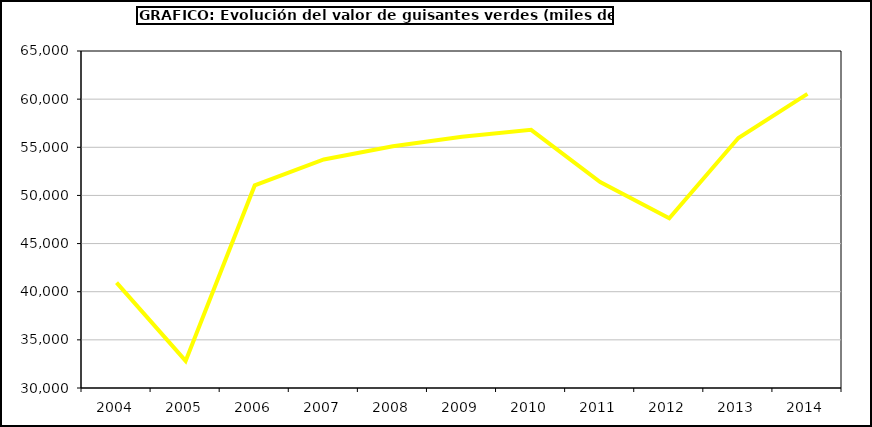
| Category | Valor |
|---|---|
| 2004.0 | 40945.269 |
| 2005.0 | 32811.593 |
| 2006.0 | 51039.987 |
| 2007.0 | 53737.412 |
| 2008.0 | 55115.003 |
| 2009.0 | 56100.148 |
| 2010.0 | 56808.753 |
| 2011.0 | 51384.72 |
| 2012.0 | 47635.04 |
| 2013.0 | 55957.374 |
| 2014.0 | 60552.887 |